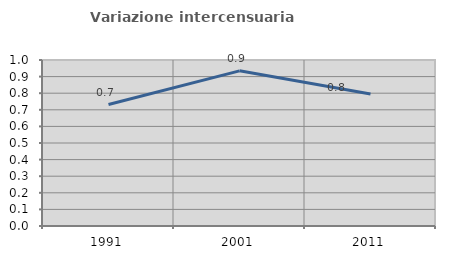
| Category | Variazione intercensuaria annua |
|---|---|
| 1991.0 | 0.732 |
| 2001.0 | 0.935 |
| 2011.0 | 0.795 |